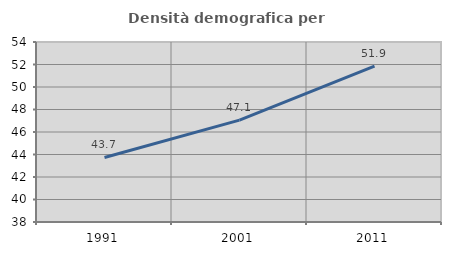
| Category | Densità demografica |
|---|---|
| 1991.0 | 43.739 |
| 2001.0 | 47.057 |
| 2011.0 | 51.864 |